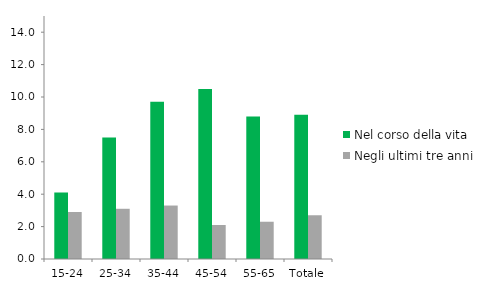
| Category | Nel corso della vita | Negli ultimi tre anni |
|---|---|---|
| 15-24 | 4.1 | 2.9 |
| 25-34 | 7.5 | 3.1 |
| 35-44 | 9.7 | 3.3 |
| 45-54 | 10.5 | 2.1 |
| 55-65 | 8.8 | 2.3 |
| Totale | 8.9 | 2.7 |